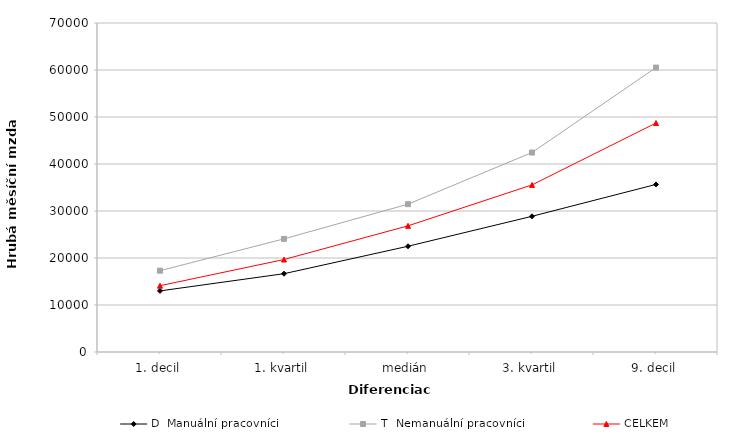
| Category | D  Manuální pracovníci | T  Nemanuální pracovníci | CELKEM |
|---|---|---|---|
| 1. decil | 12998.753 | 17298.289 | 14106.476 |
| 1. kvartil | 16660.889 | 24069.439 | 19674.234 |
| medián | 22497.441 | 31454.447 | 26842.818 |
| 3. kvartil | 28871.108 | 42438.342 | 35549.853 |
| 9. decil | 35657.392 | 60516.584 | 48718.034 |